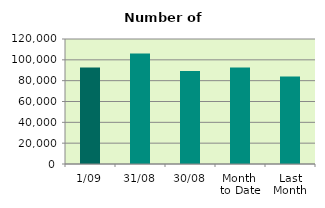
| Category | Series 0 |
|---|---|
| 1/09 | 92598 |
| 31/08 | 106128 |
| 30/08 | 89354 |
| Month 
to Date | 92598 |
| Last
Month | 83988.522 |